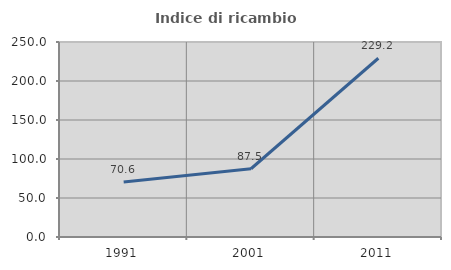
| Category | Indice di ricambio occupazionale  |
|---|---|
| 1991.0 | 70.588 |
| 2001.0 | 87.5 |
| 2011.0 | 229.167 |